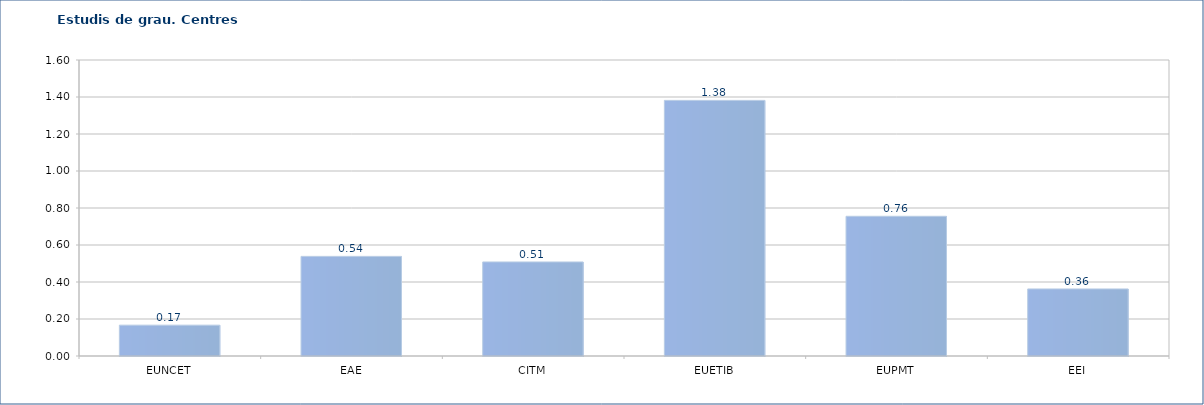
| Category | Series 0 |
|---|---|
| EUNCET | 0.167 |
| EAE | 0.538 |
| CITM | 0.508 |
| EUETIB | 1.382 |
| EUPMT | 0.755 |
| EEI | 0.362 |